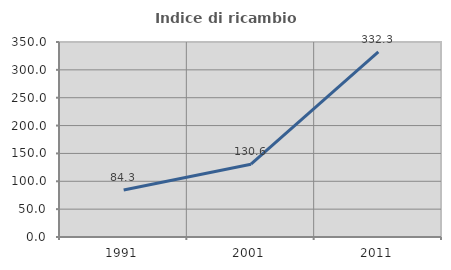
| Category | Indice di ricambio occupazionale  |
|---|---|
| 1991.0 | 84.301 |
| 2001.0 | 130.645 |
| 2011.0 | 332.292 |